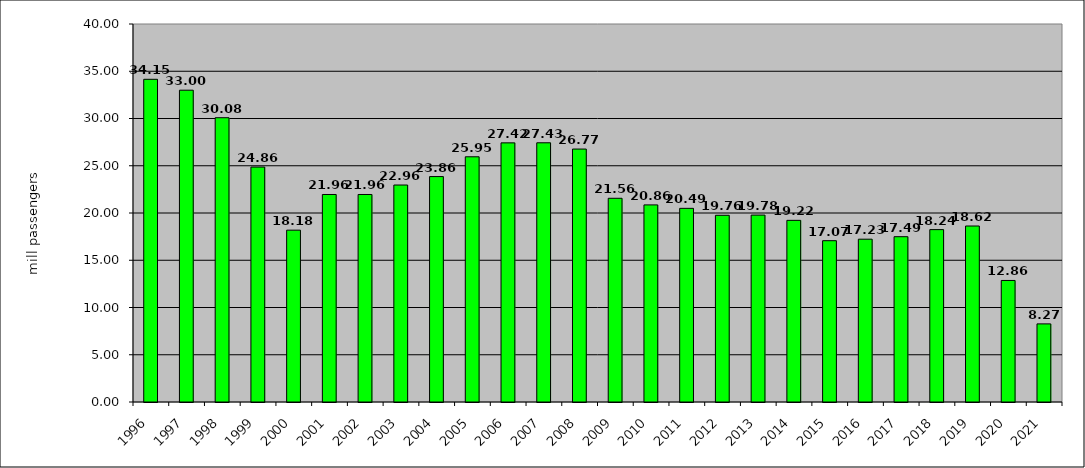
| Category | Series 0 |
|---|---|
| 1996.0 | 34.147 |
| 1997.0 | 32.995 |
| 1998.0 | 30.084 |
| 1999.0 | 24.861 |
| 2000.0 | 18.184 |
| 2001.0 | 21.959 |
| 2002.0 | 21.959 |
| 2003.0 | 22.96 |
| 2004.0 | 23.855 |
| 2005.0 | 25.948 |
| 2006.0 | 27.421 |
| 2007.0 | 27.43 |
| 2008.0 | 26.767 |
| 2009.0 | 21.556 |
| 2010.0 | 20.857 |
| 2011.0 | 20.492 |
| 2012.0 | 19.757 |
| 2013.0 | 19.78 |
| 2014.0 | 19.222 |
| 2015.0 | 17.07 |
| 2016.0 | 17.228 |
| 2017.0 | 17.493 |
| 2018.0 | 18.241 |
| 2019.0 | 18.624 |
| 2020.0 | 12.862 |
| 2021.0 | 8.266 |